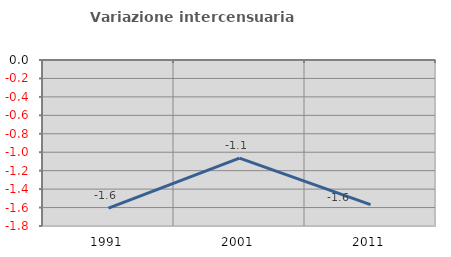
| Category | Variazione intercensuaria annua |
|---|---|
| 1991.0 | -1.607 |
| 2001.0 | -1.064 |
| 2011.0 | -1.568 |